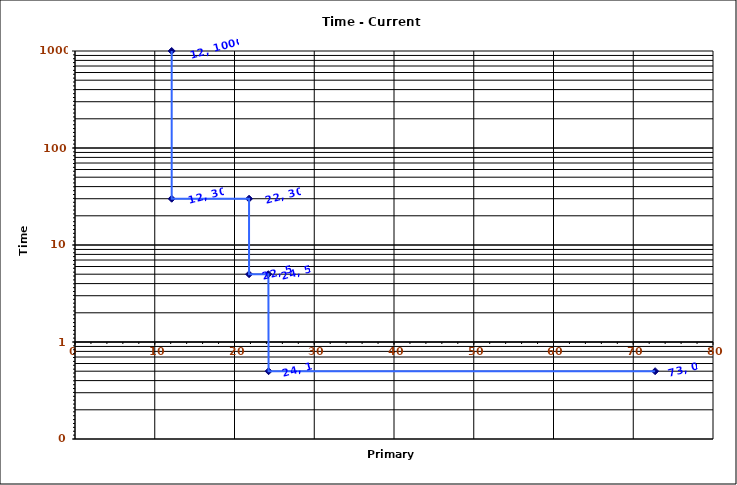
| Category | Series 0 |
|---|---|
| 12.12435565298214 | 1000 |
| 12.12435565298214 | 30 |
| 21.823840175367852 | 30.003 |
| 21.825052610933152 | 5 |
| 24.24871130596428 | 4.999 |
| 24.272960017270243 | 0.5 |
| 72.74613391789285 | 0.5 |